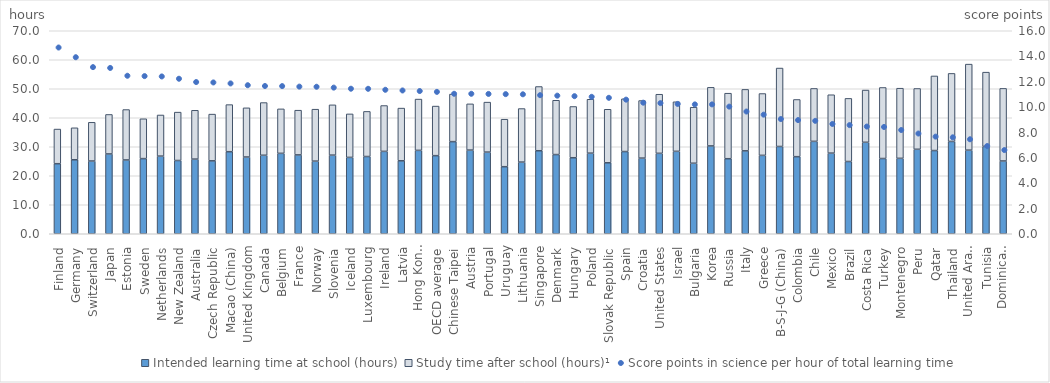
| Category | Intended learning time at school (hours) | Study time after school (hours)¹ |
|---|---|---|
| Finland | 24.155 | 11.948 |
| Germany | 25.516 | 11.024 |
| Switzerland | 25.082 | 13.352 |
| Japan | 27.524 | 13.613 |
| Estonia | 25.45 | 17.382 |
| Sweden | 25.911 | 13.738 |
| Netherlands | 26.773 | 14.182 |
| New Zealand | 25.259 | 16.686 |
| Australia | 25.743 | 16.838 |
| Czech Republic | 25.149 | 16.109 |
| Macao (China) | 28.296 | 16.24 |
| United Kingdom | 26.469 | 16.956 |
| Canada | 27.074 | 18.165 |
| Belgium | 27.728 | 15.335 |
| France | 27.195 | 15.416 |
| Norway | 25.048 | 17.905 |
| Slovenia | 27.113 | 17.338 |
| Iceland | 26.333 | 14.993 |
| Luxembourg | 26.634 | 15.554 |
| Ireland | 28.415 | 15.799 |
| Latvia | 25.158 | 18.173 |
| Hong Kong (China) | 28.758 | 17.68 |
| OECD average | 26.93 | 17.096 |
| Chinese Taipei | 31.767 | 16.399 |
| Austria | 28.847 | 15.946 |
| Portugal | 28.152 | 17.237 |
| Uruguay | 23.122 | 16.373 |
| Lithuania | 24.711 | 18.466 |
| Singapore | 28.622 | 22.152 |
| Denmark | 27.31 | 18.722 |
| Hungary | 26.213 | 17.671 |
| Poland | 27.794 | 18.583 |
| Slovak Republic | 24.477 | 18.451 |
| Spain | 28.341 | 18.195 |
| Croatia | 26.088 | 19.846 |
| United States | 27.736 | 20.373 |
| Israel | 28.423 | 17.086 |
| Bulgaria | 24.316 | 19.321 |
| Korea | 30.291 | 20.204 |
| Russia | 25.873 | 22.595 |
| Italy | 28.599 | 21.185 |
| Greece | 27.032 | 21.32 |
| B-S-J-G (China) | 30.096 | 27.048 |
| Colombia | 26.579 | 19.723 |
| Chile | 31.867 | 18.242 |
| Mexico | 27.803 | 20.133 |
| Brazil | 24.916 | 21.765 |
| Costa Rica | 31.545 | 18.004 |
| Turkey | 25.943 | 24.496 |
| Montenegro | 26.011 | 24.181 |
| Peru | 29.132 | 20.965 |
| Qatar | 28.691 | 25.722 |
| Thailand | 31.83 | 23.462 |
| United Arab Emirates | 28.831 | 29.665 |
| Tunisia | 30.111 | 25.614 |
| Dominican Republic | 25.097 | 25.028 |